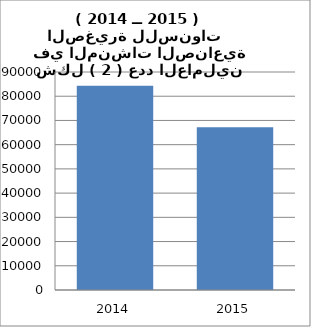
| Category | معدل عدد العاملين |
|---|---|
| 2014.0 | 84272 |
| 2015.0 | 67157 |